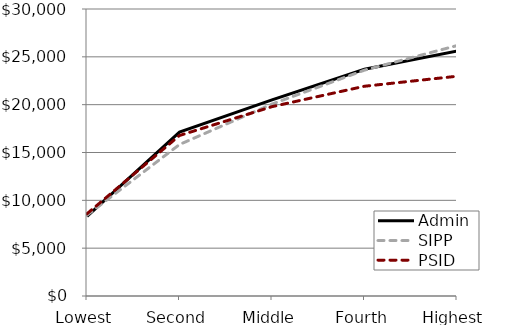
| Category | Admin | SIPP | PSID |
|---|---|---|---|
| Lowest | 8316.738 | 8456.735 | 8595.34 |
| Second | 17136.7 | 15835.07 | 16779.06 |
| Middle | 20505.255 | 20061.34 | 19791.52 |
| Fourth | 23697.231 | 23610.24 | 21926.12 |
| Highest | 25596.168 | 26176.08 | 22971.83 |